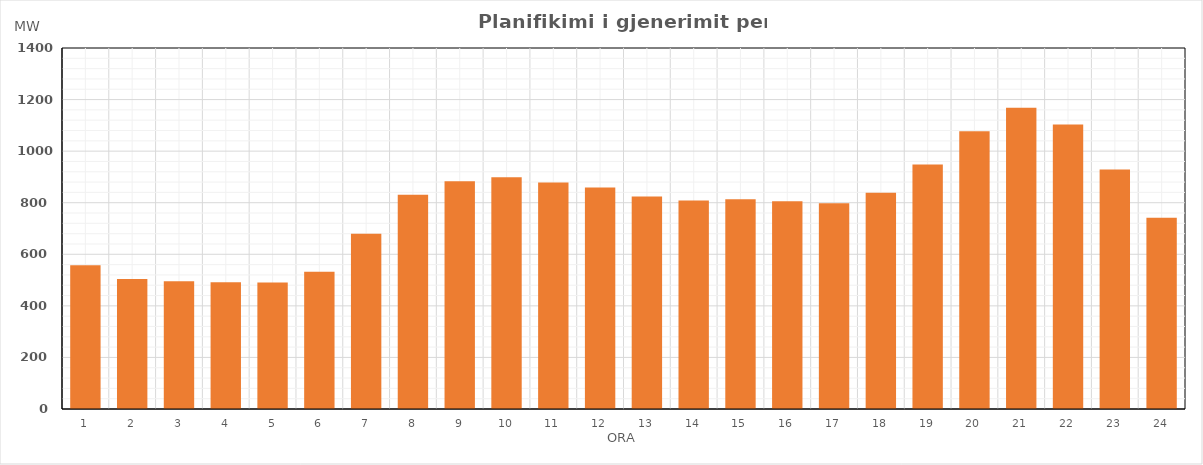
| Category | Max (MW) |
|---|---|
| 0 | 557.7 |
| 1 | 504.43 |
| 2 | 495.81 |
| 3 | 491.4 |
| 4 | 490.3 |
| 5 | 532.6 |
| 6 | 679.9 |
| 7 | 830.49 |
| 8 | 883.19 |
| 9 | 899.2 |
| 10 | 878.02 |
| 11 | 859.16 |
| 12 | 824.42 |
| 13 | 808.53 |
| 14 | 813.16 |
| 15 | 805.72 |
| 16 | 798.16 |
| 17 | 838.82 |
| 18 | 948.12 |
| 19 | 1076.79 |
| 20 | 1168.5 |
| 21 | 1103.6 |
| 22 | 928.5 |
| 23 | 741.59 |